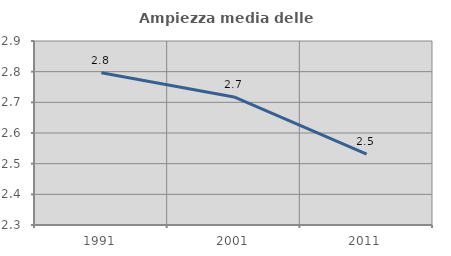
| Category | Ampiezza media delle famiglie |
|---|---|
| 1991.0 | 2.796 |
| 2001.0 | 2.717 |
| 2011.0 | 2.531 |